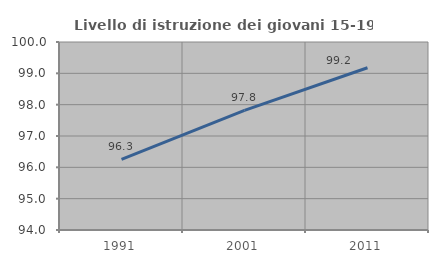
| Category | Livello di istruzione dei giovani 15-19 anni |
|---|---|
| 1991.0 | 96.253 |
| 2001.0 | 97.82 |
| 2011.0 | 99.178 |